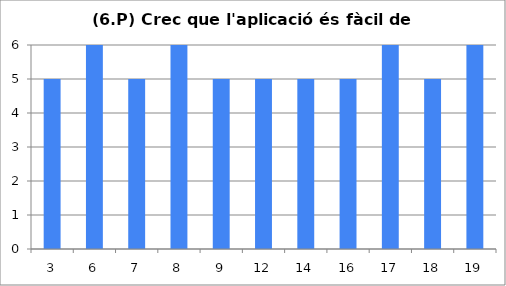
| Category | 6 |
|---|---|
| 3.0 | 5 |
| 6.0 | 6 |
| 7.0 | 5 |
| 8.0 | 6 |
| 9.0 | 5 |
| 12.0 | 5 |
| 14.0 | 5 |
| 16.0 | 5 |
| 17.0 | 6 |
| 18.0 | 5 |
| 19.0 | 6 |